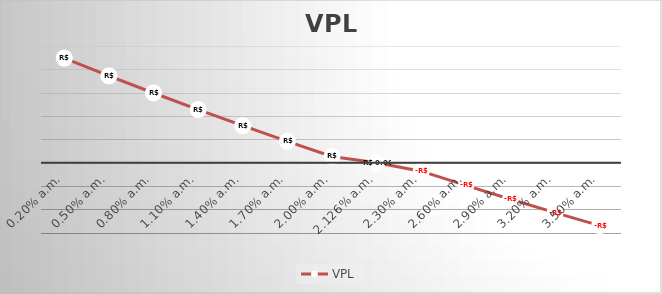
| Category | VPL |
|---|---|
| 0.002 | 224027.637 |
| 0.005 | 186088.471 |
| 0.008 | 149331.958 |
| 0.011 | 113714.178 |
| 0.013999999999999999 | 79193.05 |
| 0.016999999999999998 | 45728.242 |
| 0.019999999999999997 | 13281.096 |
| 0.021255034671745276 | 0 |
| 0.022999999999999996 | -18185.449 |
| 0.025999999999999995 | -48706.933 |
| 0.028999999999999995 | -78317.439 |
| 0.031999999999999994 | -107049.661 |
| 0.034999999999999996 | -134934.965 |